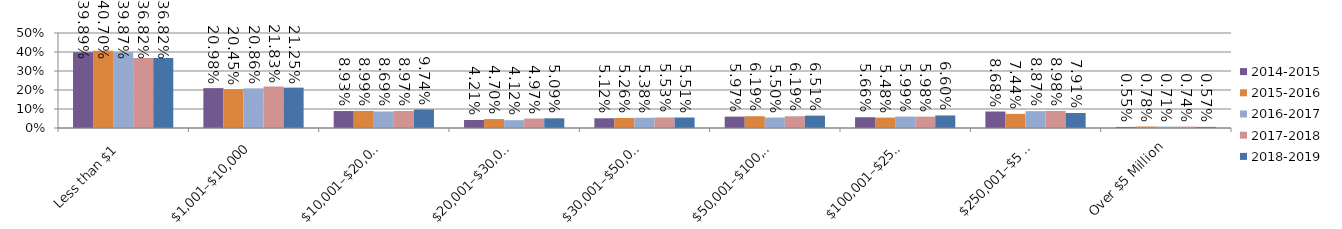
| Category | 2014-2015 | 2015-2016 | 2016-2017 | 2017-2018 | 2018-2019 |
|---|---|---|---|---|---|
| Less than $1 | 0.399 | 0.407 | 0.399 | 0.368 | 0.368 |
| $1,001–$10,000 | 0.21 | 0.205 | 0.209 | 0.218 | 0.212 |
| $10,001–$20,000 | 0.089 | 0.09 | 0.087 | 0.09 | 0.097 |
| $20,001–$30,000 | 0.042 | 0.047 | 0.041 | 0.05 | 0.051 |
| $30,001–$50,000 | 0.051 | 0.053 | 0.054 | 0.055 | 0.055 |
| $50,001–$100,000 | 0.06 | 0.062 | 0.055 | 0.062 | 0.065 |
| $100,001–$250,000 | 0.057 | 0.055 | 0.06 | 0.06 | 0.066 |
| $250,001–$5 million | 0.087 | 0.074 | 0.089 | 0.09 | 0.079 |
| Over $5 Million | 0.006 | 0.008 | 0.007 | 0.007 | 0.006 |